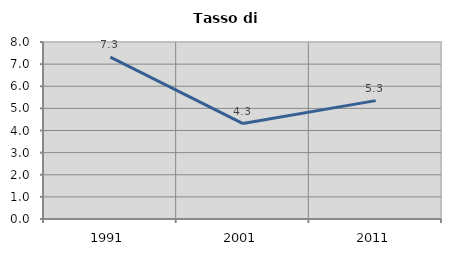
| Category | Tasso di disoccupazione   |
|---|---|
| 1991.0 | 7.317 |
| 2001.0 | 4.314 |
| 2011.0 | 5.35 |